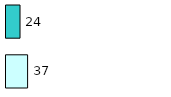
| Category | Series 0 | Series 1 |
|---|---|---|
| 0 | 37 | 24 |